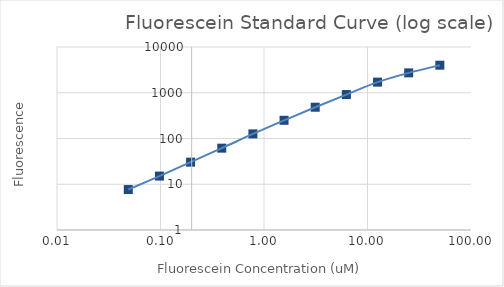
| Category | Series 1 |
|---|---|
| 50.0 | 4002.19 |
| 25.0 | 2721.895 |
| 12.5 | 1706.872 |
| 6.25 | 913.051 |
| 3.125 | 482.926 |
| 1.5625 | 249.926 |
| 0.78125 | 126.116 |
| 0.390625 | 61.485 |
| 0.1953125 | 30.41 |
| 0.09765625 | 15.084 |
| 0.048828125 | 7.661 |